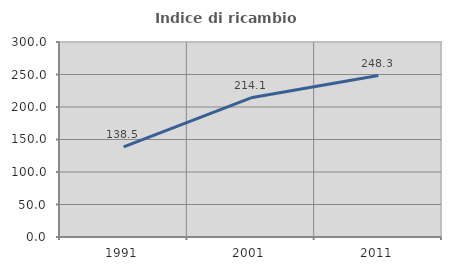
| Category | Indice di ricambio occupazionale  |
|---|---|
| 1991.0 | 138.55 |
| 2001.0 | 214.103 |
| 2011.0 | 248.344 |